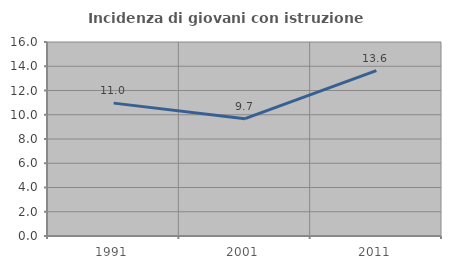
| Category | Incidenza di giovani con istruzione universitaria |
|---|---|
| 1991.0 | 10.959 |
| 2001.0 | 9.677 |
| 2011.0 | 13.636 |